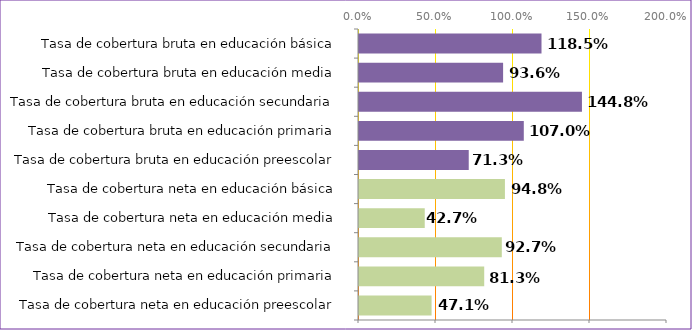
| Category | Series 0 |
|---|---|
| Tasa de cobertura neta en educación preescolar | 0.471 |
| Tasa de cobertura neta en educación primaria | 0.813 |
| Tasa de cobertura neta en educación secundaria | 0.927 |
| Tasa de cobertura neta en educación media | 0.427 |
| Tasa de cobertura neta en educación básica | 0.948 |
| Tasa de cobertura bruta en educación preescolar | 0.713 |
| Tasa de cobertura bruta en educación primaria | 1.07 |
| Tasa de cobertura bruta en educación secundaria | 1.448 |
| Tasa de cobertura bruta en educación media | 0.936 |
| Tasa de cobertura bruta en educación básica | 1.185 |